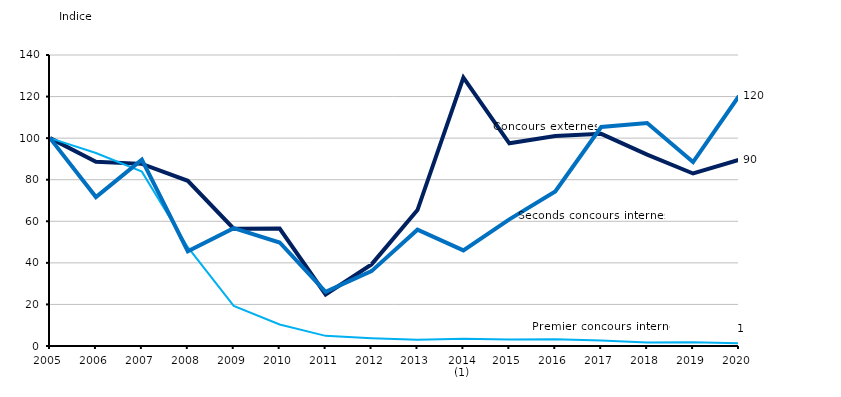
| Category | Concours externes  | Premier concours interne | Seconds concours internes |
|---|---|---|---|
| 2005 | 100 | 100 | 100 |
| 2006 | 88.613 | 92.877 | 71.648 |
| 2007 | 87.624 | 83.879 | 89.655 |
| 2008 | 79.501 | 47.546 | 45.594 |
| 2009 | 56.405 | 19.291 | 56.705 |
| 2010 | 56.526 | 10.327 | 49.808 |
| 2011 | 24.817 | 4.874 | 26.054 |
| 2012 | 39.268 | 3.783 | 36.015 |
| 2013 | 65.396 | 2.965 | 55.939 |
| 2014 (1) | 129.176 | 3.545 | 45.977 |
| 2015 | 97.523 | 3.067 | 60.92 |
| 2016 | 101.07 | 3.306 | 74.33 |
| 2017 | 102.059 | 2.59 | 105.364 |
| 2018 | 92.095 | 1.704 | 107.28 |
| 2019 | 83 | 1.772 | 88.506 |
| 2020 | 89.53 | 1.329 | 120.307 |